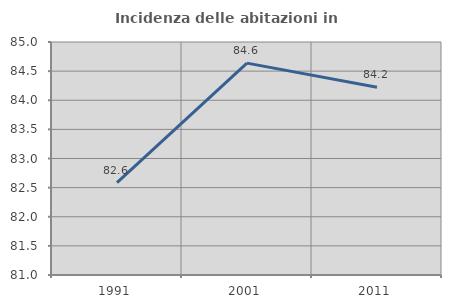
| Category | Incidenza delle abitazioni in proprietà  |
|---|---|
| 1991.0 | 82.587 |
| 2001.0 | 84.637 |
| 2011.0 | 84.225 |